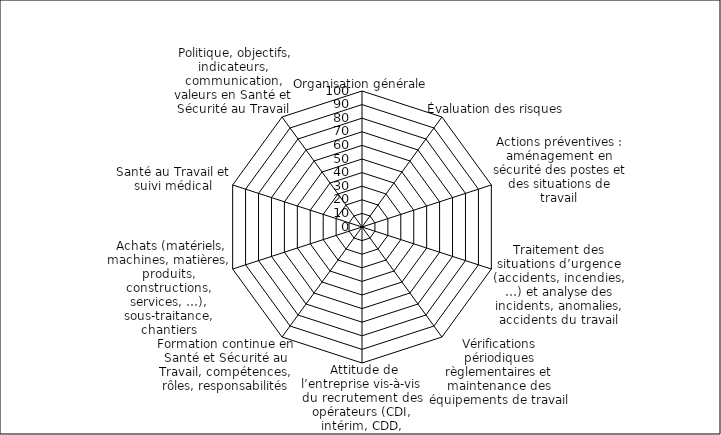
| Category | Series 0 | Series 1 | Series 2 | Series 3 | Series 4 | Series 5 | Series 6 | Series 7 | Series 8 | Series 9 | Series 10 | Series 11 | Series 12 | Series 13 | Series 14 | Series 15 | Series 16 | Series 17 | Series 18 | Series 19 | Series 20 | Perspectives N + 6 mois | Cotation N |
|---|---|---|---|---|---|---|---|---|---|---|---|---|---|---|---|---|---|---|---|---|---|---|---|
| Organisation générale |  |  |  |  |  |  |  |  |  |  |  |  |  |  |  |  |  |  |  |  |  | 0 | 0 |
| Évaluation des risques |  |  |  |  |  |  |  |  |  |  |  |  |  |  |  |  |  |  |  |  |  | 0 | 0 |
| Actions préventives : aménagement en sécurité des postes et des situations de travail |  |  |  |  |  |  |  |  |  |  |  |  |  |  |  |  |  |  |  |  |  | 0 | 0 |
| Traitement des situations d’urgence (accidents, incendies, …) et analyse des incidents, anomalies, accidents du travail |  |  |  |  |  |  |  |  |  |  |  |  |  |  |  |  |  |  |  |  |  | 0 | 0 |
| Vérifications périodiques règlementaires et maintenance des équipements de travail |  |  |  |  |  |  |  |  |  |  |  |  |  |  |  |  |  |  |  |  |  | 0 | 0 |
|  Attitude de l’entreprise vis-à-vis du recrutement des opérateurs (CDI, intérim, CDD, stagiaires, apprentis, …) |  |  |  |  |  |  |  |  |  |  |  |  |  |  |  |  |  |  |  |  |  | 0 | 0 |
| Formation continue en Santé et Sécurité au Travail, compétences, rôles, responsabilités |  |  |  |  |  |  |  |  |  |  |  |  |  |  |  |  |  |  |  |  |  | 0 | 0 |
|  Achats (matériels, machines, matières, produits, constructions, services, …), sous-traitance, chantiers |  |  |  |  |  |  |  |  |  |  |  |  |  |  |  |  |  |  |  |  |  | 0 | 0 |
| Santé au Travail et suivi médical |  |  |  |  |  |  |  |  |  |  |  |  |  |  |  |  |  |  |  |  |  | 0 | 0 |
|  Politique, objectifs, indicateurs, communication, valeurs en Santé et Sécurité au Travail |  |  |  |  |  |  |  |  |  |  |  |  |  |  |  |  |  |  |  |  |  | 0 | 0 |